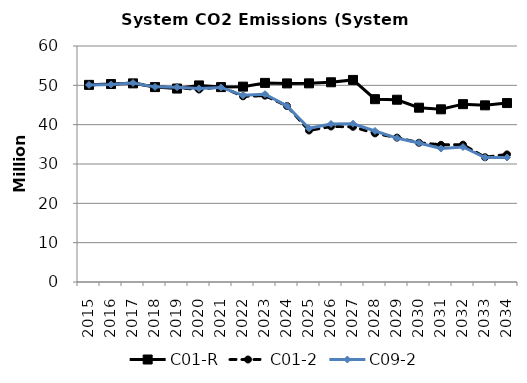
| Category | C01-R | C01-2 | C09-2 |
|---|---|---|---|
| 2015.0 | 50.118 | 50.118 | 50.112 |
| 2016.0 | 50.329 | 50.238 | 50.225 |
| 2017.0 | 50.499 | 50.622 | 50.601 |
| 2018.0 | 49.555 | 49.636 | 49.612 |
| 2019.0 | 49.181 | 49.421 | 49.523 |
| 2020.0 | 49.976 | 48.938 | 49.212 |
| 2021.0 | 49.548 | 49.665 | 49.468 |
| 2022.0 | 49.671 | 47.203 | 47.465 |
| 2023.0 | 50.618 | 47.383 | 47.74 |
| 2024.0 | 50.491 | 44.746 | 44.782 |
| 2025.0 | 50.508 | 38.519 | 39.07 |
| 2026.0 | 50.777 | 39.539 | 40.179 |
| 2027.0 | 51.38 | 39.462 | 40.238 |
| 2028.0 | 46.481 | 37.785 | 38.399 |
| 2029.0 | 46.342 | 36.715 | 36.579 |
| 2030.0 | 44.317 | 35.397 | 35.357 |
| 2031.0 | 43.901 | 34.881 | 33.924 |
| 2032.0 | 45.215 | 34.915 | 34.316 |
| 2033.0 | 44.915 | 31.713 | 31.622 |
| 2034.0 | 45.496 | 32.435 | 31.65 |